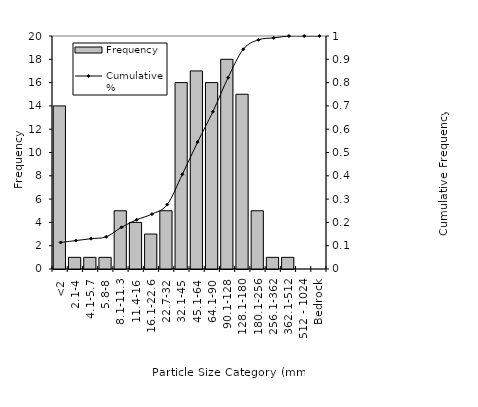
| Category | Frequency |
|---|---|
| <2 | 14 |
| 2.1-4 | 1 |
| 4.1-5.7 | 1 |
| 5.8-8 | 1 |
| 8.1-11.3 | 5 |
| 11.4-16 | 4 |
| 16.1-22.6 | 3 |
| 22.7-32 | 5 |
| 32.1-45 | 16 |
| 45.1-64 | 17 |
| 64.1-90 | 16 |
| 90.1-128 | 18 |
| 128.1-180 | 15 |
| 180.1-256 | 5 |
| 256.1-362 | 1 |
| 362.1-512 | 1 |
| 512 - 1024 | 0 |
| Bedrock | 0 |